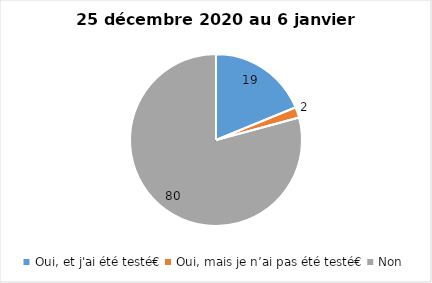
| Category | Series 0 |
|---|---|
| Oui, et j'ai été testé€ | 19 |
| Oui, mais je n’ai pas été testé€ | 2 |
| Non | 80 |